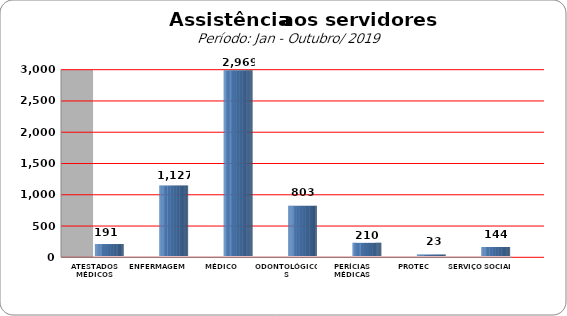
| Category | Series 0 |
|---|---|
| ATESTADOS MÉDICOS | 191 |
| ENFERMAGEM | 1127 |
| MÉDICO | 2969 |
| ODONTOLÓGICOS | 803 |
| PERÍCIAS MÉDICAS | 210 |
| PROTEC | 23 |
| SERVIÇO SOCIAL | 144 |